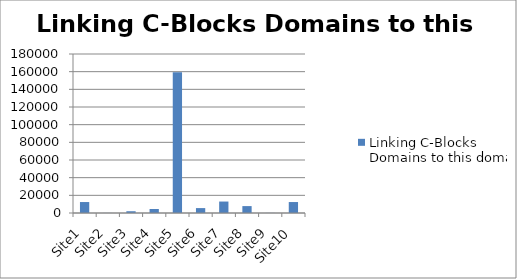
| Category | Linking C-Blocks Domains to this domain |
|---|---|
| Site1 | 12410 |
| Site2 | 80 |
| Site3 | 1997 |
| Site4 | 4551 |
| Site5 | 159297 |
| Site6 | 5553 |
| Site7 | 12971 |
| Site8 | 7817 |
| Site9 | 107 |
| Site10 | 12410 |